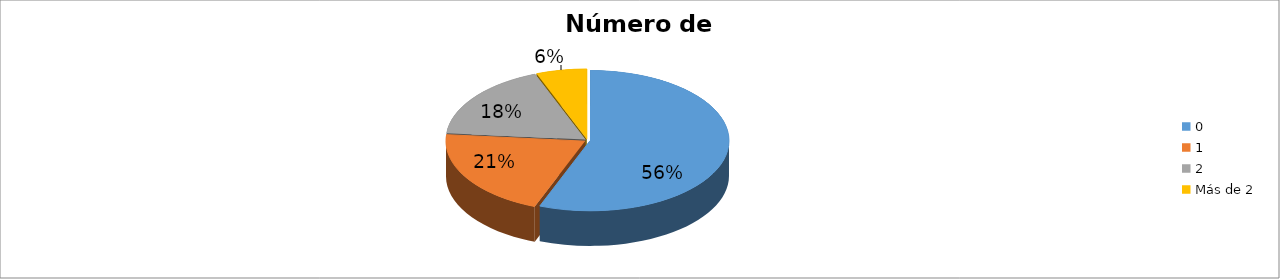
| Category | Series 0 |
|---|---|
| 0 | 0.559 |
| 1 | 0.206 |
| 2 | 0.176 |
| Más de 2 | 0.059 |